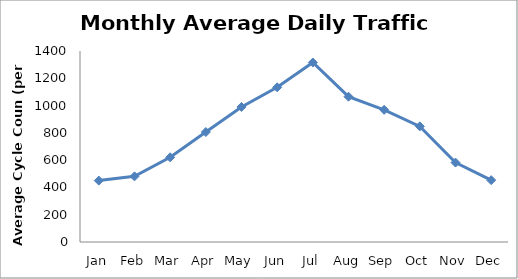
| Category | Series 0 |
|---|---|
| Jan | 450 |
| Feb | 481.25 |
| Mar | 620.75 |
| Apr | 806 |
| May | 990 |
| Jun | 1133.75 |
| Jul | 1315.75 |
| Aug | 1065 |
| Sep | 968.75 |
| Oct | 847.5 |
| Nov | 582.25 |
| Dec | 453.25 |